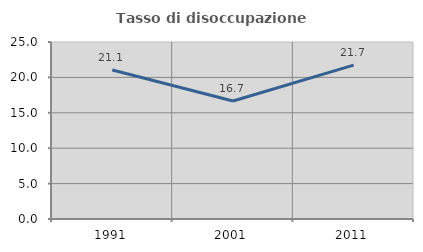
| Category | Tasso di disoccupazione giovanile  |
|---|---|
| 1991.0 | 21.053 |
| 2001.0 | 16.667 |
| 2011.0 | 21.739 |